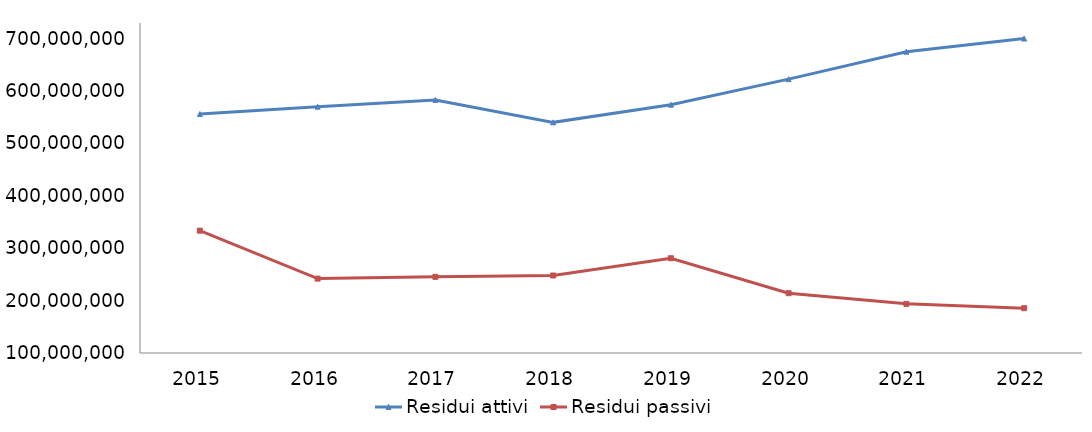
| Category | Residui attivi | Residui passivi |
|---|---|---|
| 2015.0 | 556096016.53 | 333523579.03 |
| 2016.0 | 570250447.74 | 242001182.48 |
| 2017.0 | 583147880.58 | 245369461.69 |
| 2018.0 | 540317213.86 | 247964841.58 |
| 2019.0 | 574098811.25 | 280927788.78 |
| 2020.0 | 622813781.35 | 214177510.02 |
| 2021.0 | 675200536.31 | 193803586.08 |
| 2022.0 | 700370268.32 | 185526771.04 |